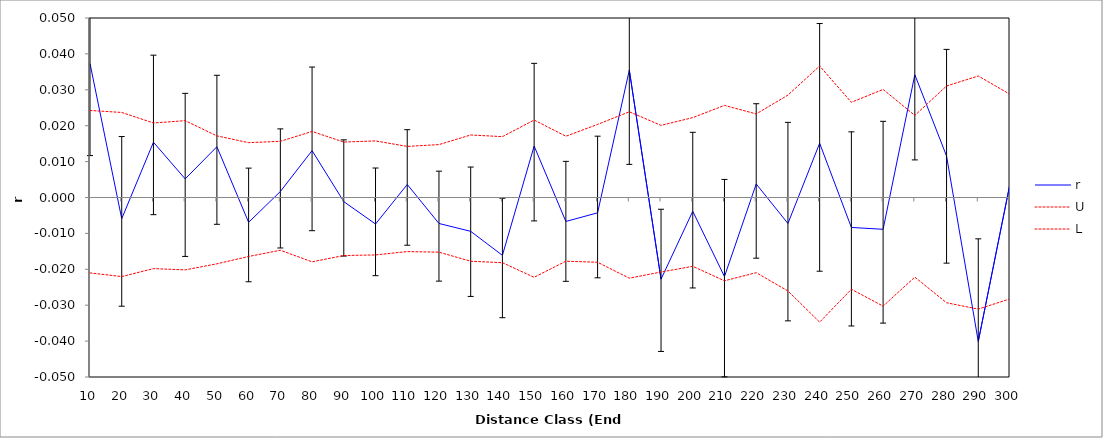
| Category | r | U | L |
|---|---|---|---|
| 10.0 | 0.037 | 0.024 | -0.021 |
| 20.0 | -0.006 | 0.024 | -0.022 |
| 30.0 | 0.015 | 0.021 | -0.02 |
| 40.0 | 0.005 | 0.021 | -0.02 |
| 50.0 | 0.014 | 0.017 | -0.018 |
| 60.0 | -0.007 | 0.015 | -0.016 |
| 70.0 | 0.002 | 0.016 | -0.015 |
| 80.0 | 0.013 | 0.018 | -0.018 |
| 90.0 | -0.001 | 0.015 | -0.016 |
| 100.0 | -0.007 | 0.016 | -0.016 |
| 110.0 | 0.004 | 0.014 | -0.015 |
| 120.0 | -0.007 | 0.015 | -0.015 |
| 130.0 | -0.009 | 0.017 | -0.018 |
| 140.0 | -0.016 | 0.017 | -0.018 |
| 150.0 | 0.014 | 0.022 | -0.022 |
| 160.0 | -0.007 | 0.017 | -0.018 |
| 170.0 | -0.004 | 0.02 | -0.018 |
| 180.0 | 0.035 | 0.024 | -0.022 |
| 190.0 | -0.023 | 0.02 | -0.021 |
| 200.0 | -0.004 | 0.022 | -0.019 |
| 210.0 | -0.022 | 0.026 | -0.023 |
| 220.0 | 0.004 | 0.023 | -0.021 |
| 230.0 | -0.007 | 0.029 | -0.026 |
| 240.0 | 0.015 | 0.037 | -0.035 |
| 250.0 | -0.008 | 0.027 | -0.026 |
| 260.0 | -0.009 | 0.03 | -0.03 |
| 270.0 | 0.034 | 0.023 | -0.022 |
| 280.0 | 0.012 | 0.031 | -0.029 |
| 290.0 | -0.04 | 0.034 | -0.031 |
| 300.0 | 0.004 | 0.029 | -0.028 |